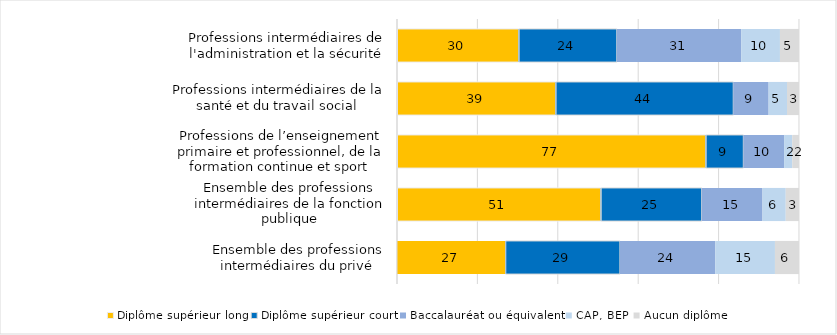
| Category | Diplôme supérieur long | Diplôme supérieur court | Baccalauréat ou équivalent | CAP, BEP | Aucun diplôme |
|---|---|---|---|---|---|
| Professions intermédiaires de l'administration et la sécurité | 30.259 | 24.43 | 30.941 | 9.637 | 4.734 |
| Professions intermédiaires de la santé et du travail social | 39.447 | 44.202 | 8.796 | 4.573 | 2.983 |
| Professions de l’enseignement primaire et professionnel, de la formation continue et sport | 76.787 | 9.368 | 10.142 | 2.028 | 1.675 |
| Ensemble des professions intermédiaires de la fonction publique | 50.673 | 25.13 | 15.122 | 5.784 | 3.29 |
| Ensemble des professions intermédiaires du privé | 26.936 | 28.521 | 23.729 | 14.838 | 5.977 |